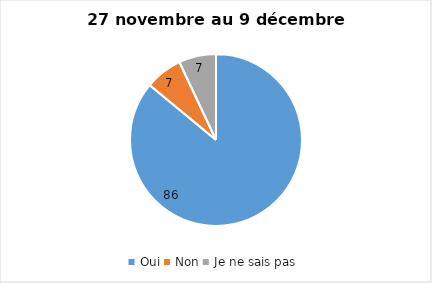
| Category | Series 0 |
|---|---|
| Oui | 86 |
| Non | 7 |
| Je ne sais pas | 7 |